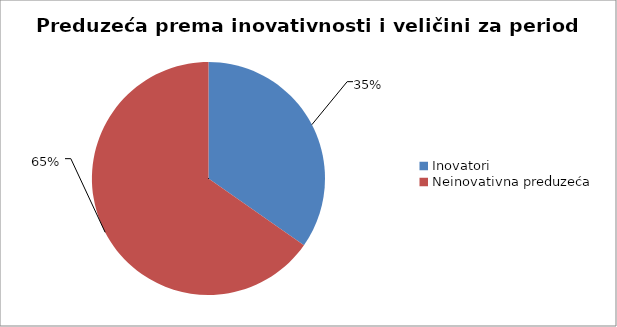
| Category | Preduzeća prema inovativnosti i veličini za period 2020-2022 |
|---|---|
| Inovatori  | 1397.109 |
| Neinovativna preduzeća    | 2626.905 |